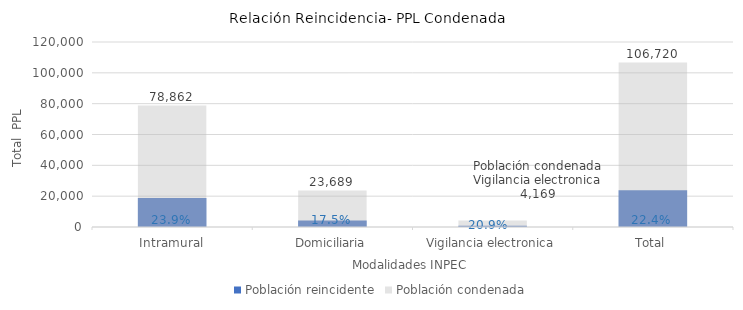
| Category | Población reincidente | Población condenada |
|---|---|---|
| Intramural | 18835 | 78862 |
| Domiciliaria | 4151 | 23689 |
| Vigilancia electronica | 872 | 4169 |
| Total | 23858 | 106720 |